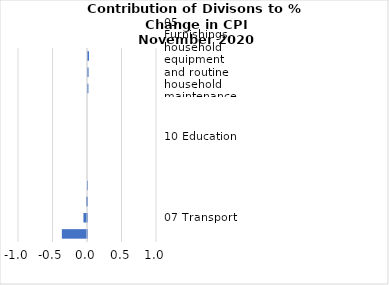
| Category |     Contributions |
|---|---|
| 05 Furnishings, household equipment and routine household maintenance | 0.014 |
| 06 Health | 0.008 |
| 02 Alcoholic beverages, tobacco and narcotics | 0.006 |
| 11 Restaurants and hotels | 0 |
| 03 Clothing and footwear | 0 |
| 10 Education | 0 |
| 08 Communication | 0 |
| 09 Recreation and culture | 0 |
| 12 Miscellaneous goods and services | 0 |
| 04 Housing, water, electricity, gas and other fuels | -0.014 |
| 07 Transport | -0.052 |
| 01 Food and non-alcoholic beverages | -0.365 |